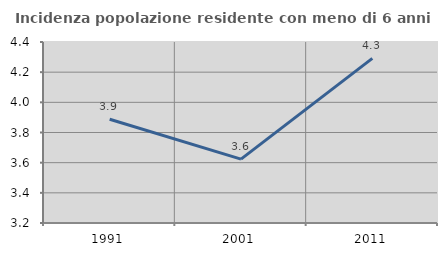
| Category | Incidenza popolazione residente con meno di 6 anni |
|---|---|
| 1991.0 | 3.888 |
| 2001.0 | 3.623 |
| 2011.0 | 4.292 |